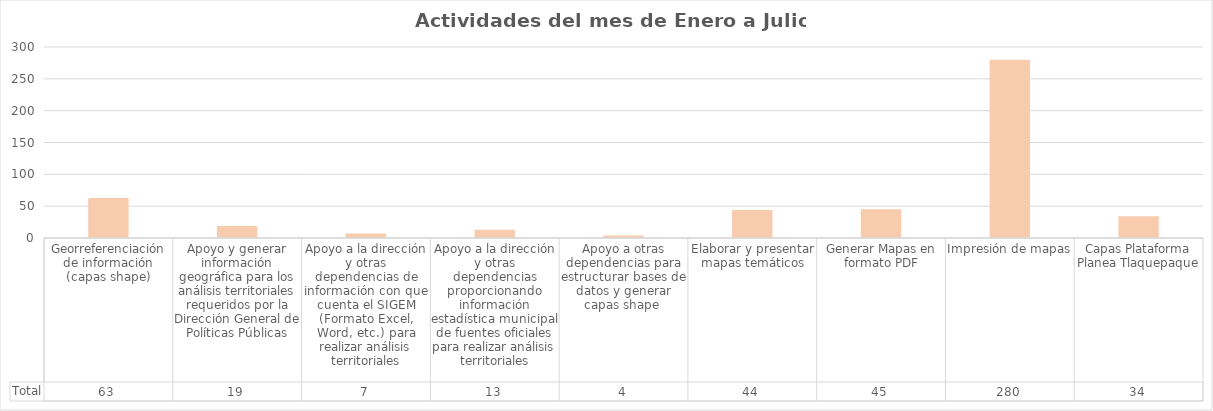
| Category | Total |
|---|---|
| Georreferenciación de información (capas shape) | 63 |
| Apoyo y generar información geográfica para los análisis territoriales requeridos por la Dirección General de Políticas Públicas | 19 |
| Apoyo a la dirección y otras dependencias de información con que cuenta el SIGEM (Formato Excel, Word, etc.) para realizar análisis territoriales | 7 |
| Apoyo a la dirección y otras dependencias proporcionando información estadística municipal de fuentes oficiales para realizar análisis territoriales | 13 |
| Apoyo a otras dependencias para estructurar bases de datos y generar capas shape  | 4 |
| Elaborar y presentar mapas temáticos | 44 |
| Generar Mapas en formato PDF | 45 |
| Impresión de mapas | 280 |
| Capas Plataforma Planea Tlaquepaque | 34 |